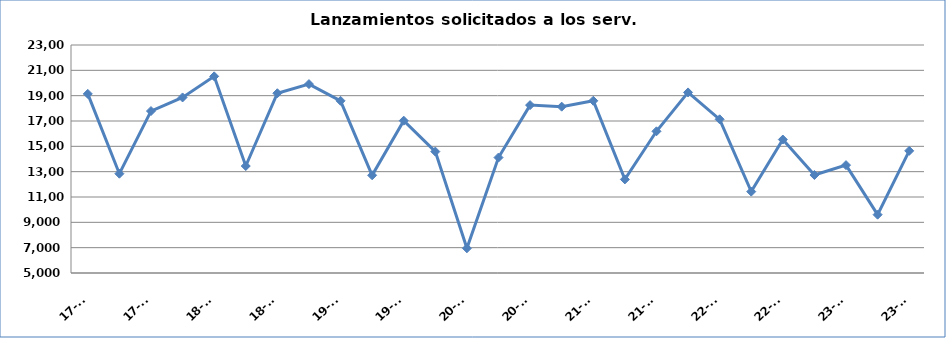
| Category | Lanamientos solicitados a los serv.comunes |
|---|---|
| 17-T2 | 19141 |
| 17-T3 | 12840 |
| 17-T4 | 17786 |
| 18-T1 | 18859 |
| 18-T2 | 20526 |
| 18-T3 | 13446 |
| 18-T4 | 19192 |
| 19-T1 | 19913 |
| 19-T2 | 18594 |
| 19-T3 | 12715 |
| 19-T4 | 17025 |
| 20-T1 | 14586 |
| 20-T2 | 6953 |
| 20-T3 | 14117 |
| 20-T4 | 18255 |
| 21-T1 | 18131 |
| 21-T2 | 18598 |
| 21-T3 | 12390 |
| 21-T4 | 16187 |
| 22-T1 | 19257 |
| 22-T2 | 17134 |
| 22-T3 | 11425 |
| 22-T4 | 15536 |
| 23-T1 | 12736 |
| 23-T2 | 13516 |
| 23-T3 | 9605 |
| 23-T4 | 14645 |